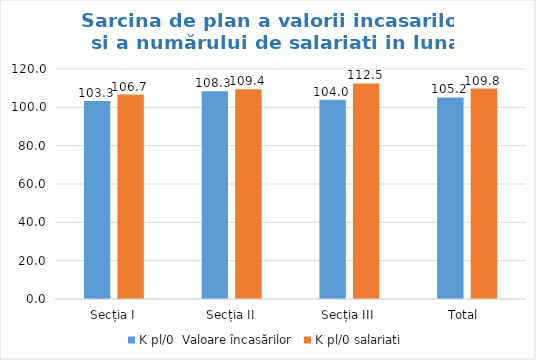
| Category | K pl/0  Valoare încasărilor | K pl/0 salariati |
|---|---|---|
| Secția I | 103.333 | 106.667 |
| Secția II | 108.333 | 109.375 |
| Secția III | 104 | 112.5 |
| Total  | 105.172 | 109.804 |